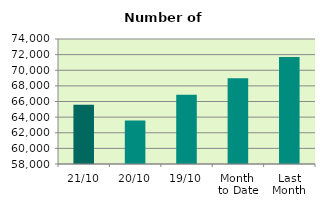
| Category | Series 0 |
|---|---|
| 21/10 | 65572 |
| 20/10 | 63570 |
| 19/10 | 66860 |
| Month 
to Date | 68974.667 |
| Last
Month | 71692 |